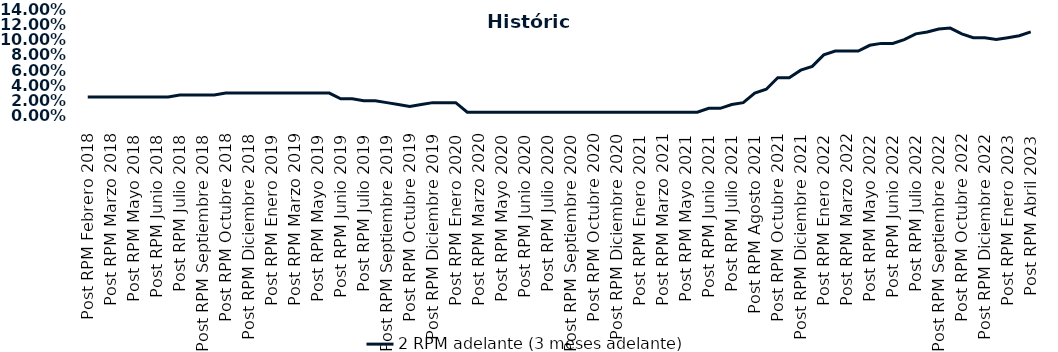
| Category | 2 RPM adelante (3 meses adelante) |
|---|---|
| Post RPM Febrero 2018 | 0.025 |
| Pre RPM Marzo 2018 | 0.025 |
| Post RPM Marzo 2018 | 0.025 |
| Pre RPM Mayo 2018 | 0.025 |
| Post RPM Mayo 2018 | 0.025 |
| Pre RPM Junio 2018 | 0.025 |
| Post RPM Junio 2018 | 0.025 |
| Pre RPM Julio 2018 | 0.025 |
| Post RPM Julio 2018 | 0.028 |
| Pre RPM Septiembre 2018 | 0.028 |
| Post RPM Septiembre 2018 | 0.028 |
| Pre RPM Octubre 2018 | 0.028 |
| Post RPM Octubre 2018 | 0.03 |
| Pre RPM Diciembre 2018 | 0.03 |
| Post RPM Diciembre 2018 | 0.03 |
| Pre RPM Enero 2019 | 0.03 |
| Post RPM Enero 2019 | 0.03 |
| Pre RPM Marzo 2019 | 0.03 |
| Post RPM Marzo 2019 | 0.03 |
| Pre RPM Mayo 2019 | 0.03 |
| Post RPM Mayo 2019 | 0.03 |
| Pre RPM Junio 2019 | 0.03 |
| Post RPM Junio 2019 | 0.022 |
| Pre RPM Julio 2019 | 0.022 |
| Post RPM Julio 2019 | 0.02 |
| Pre RPM Septiembre 2019 | 0.02 |
| Post RPM Septiembre 2019 | 0.018 |
| Pre RPM Octubre 2019 | 0.015 |
| Post RPM Octubre 2019 | 0.012 |
| Pre RPM Diciembre 2019 | 0.015 |
| Post RPM Diciembre 2019 | 0.018 |
| Pre RPM Enero 2020 | 0.018 |
| Post RPM Enero 2020 | 0.018 |
| Pre RPM Marzo 2020 | 0.005 |
| Post RPM Marzo 2020 | 0.005 |
| Pre RPM Mayo 2020 | 0.005 |
| Post RPM Mayo 2020 | 0.005 |
| Pre RPM Junio 2020 | 0.005 |
| Post RPM Junio 2020 | 0.005 |
| Pre RPM Julio 2020 | 0.005 |
| Post RPM Julio 2020 | 0.005 |
| Pre RPM Septiembre 2020 | 0.005 |
| Post RPM Septiembre 2020 | 0.005 |
| Pre RPM Octubre 2020 | 0.005 |
| Post RPM Octubre 2020 | 0.005 |
| Pre RPM Diciembre 2020 | 0.005 |
| Post RPM Diciembre 2020 | 0.005 |
| Pre RPM Enero 2021 | 0.005 |
| Post RPM Enero 2021 | 0.005 |
| Pre RPM Marzo 2021 | 0.005 |
| Post RPM Marzo 2021 | 0.005 |
| Pre RPM Mayo 2021 | 0.005 |
| Post RPM Mayo 2021 | 0.005 |
| Pre RPM Junio 2021 | 0.005 |
| Post RPM Junio 2021 | 0.01 |
| Pre RPM Julio 2021 | 0.01 |
| Post RPM Julio 2021 | 0.015 |
| Pre RPM Agosto 2021 | 0.018 |
| Post RPM Agosto 2021 | 0.03 |
| Pre RPM Octubre 2021 | 0.035 |
| Post RPM Octubre 2021 | 0.05 |
| Pre RPM Diciembre 2021 | 0.05 |
| Post RPM Diciembre 2021 | 0.06 |
| Pre RPM Enero 2022 | 0.065 |
| Post RPM Enero 2022 | 0.08 |
| Pre RPM Marzo 2022 | 0.085 |
| Post RPM Marzo 2022 | 0.085 |
| Pre RPM Mayo 2022 | 0.085 |
| Post RPM Mayo 2022 | 0.092 |
| Pre RPM Junio 2022 | 0.095 |
| Post RPM Junio 2022 | 0.095 |
| Pre RPM Julio 2022 | 0.1 |
| Post RPM Julio 2022 | 0.108 |
| Pre RPM Septiembre 2022 | 0.11 |
| Post RPM Septiembre 2022 | 0.114 |
| Pre RPM Octubre 2022 | 0.115 |
| Post RPM Octubre 2022 | 0.108 |
| Pre RPM Diciembre 2022 | 0.102 |
| Post RPM Diciembre 2022 | 0.102 |
| Pre RPM Enero 2023 | 0.1 |
| Post RPM Enero 2023 | 0.102 |
| Pre RPM Abril 2023 | 0.105 |
| Post RPM Abril 2023 | 0.11 |